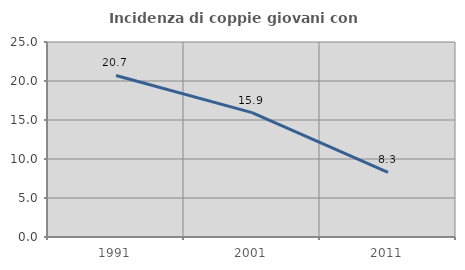
| Category | Incidenza di coppie giovani con figli |
|---|---|
| 1991.0 | 20.706 |
| 2001.0 | 15.946 |
| 2011.0 | 8.281 |